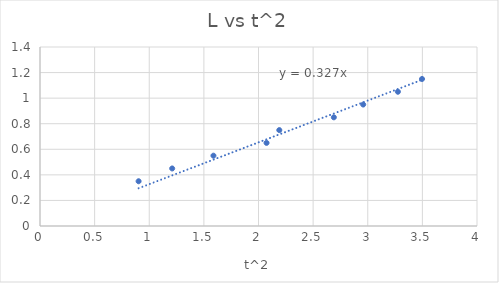
| Category | L |
|---|---|
| 3.4969000000000006 | 1.15 |
| 3.2761 | 1.05 |
| 2.9583999999999997 | 0.95 |
| 2.6895999999999995 | 0.85 |
| 2.1904 | 0.75 |
| 2.0736 | 0.65 |
| 1.5876000000000001 | 0.55 |
| 1.2100000000000002 | 0.45 |
| 0.9025 | 0.35 |